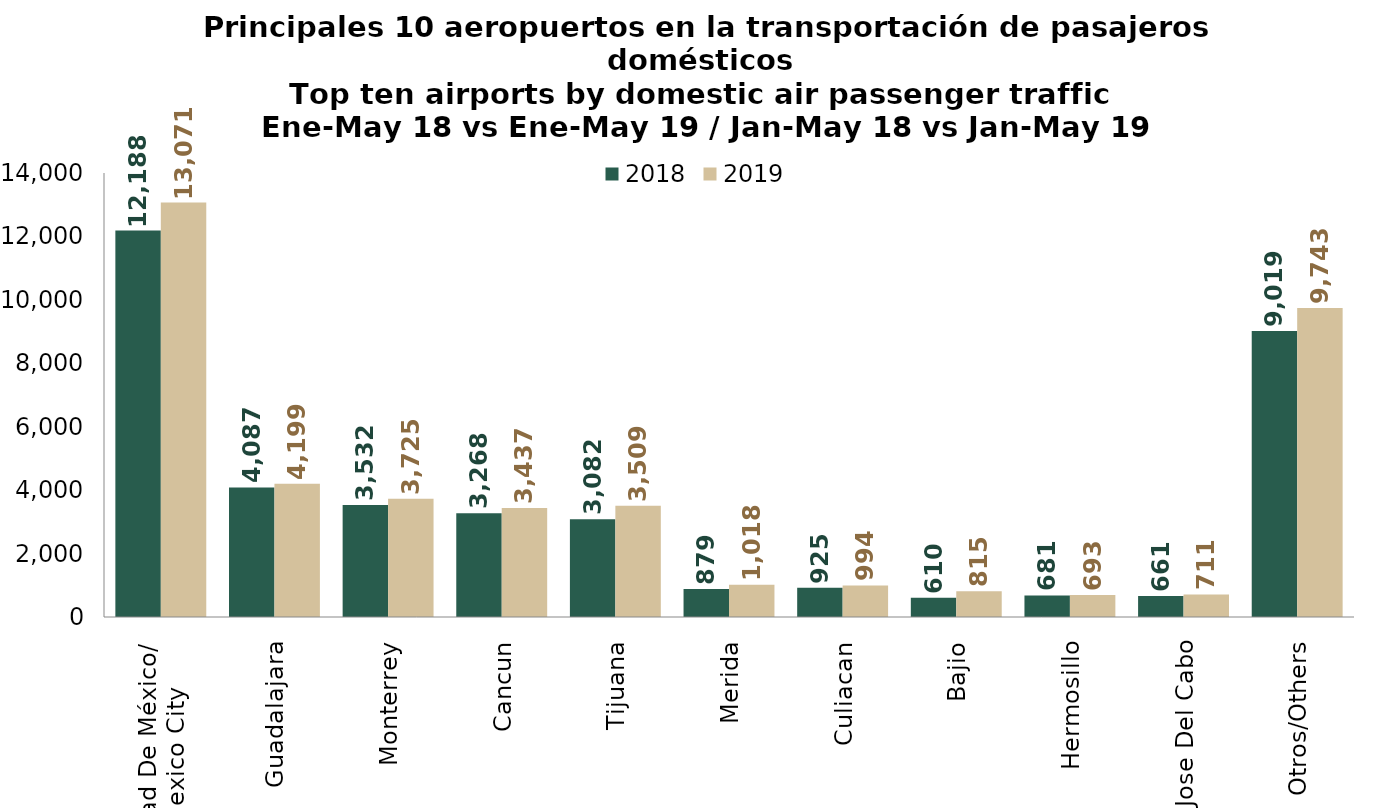
| Category | 2018 | 2019 |
|---|---|---|
| Ciudad De México/
Mexico City | 12187.848 | 13071.022 |
| Guadalajara | 4086.945 | 4198.852 |
| Monterrey | 3532.013 | 3725.282 |
| Cancun | 3268.256 | 3437.052 |
| Tijuana | 3081.633 | 3509.039 |
| Merida | 879.149 | 1017.51 |
| Culiacan | 925.39 | 993.756 |
| Bajio | 610.324 | 814.557 |
| Hermosillo | 680.907 | 692.935 |
| San Jose Del Cabo | 660.915 | 711.272 |
| Otros/Others | 9018.783 | 9742.747 |